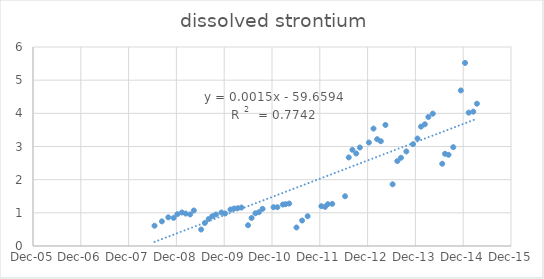
| Category | Series 0 |
|---|---|
| 39618.0 | 0.611 |
| 39674.0 | 0.743 |
| 39723.0 | 0.864 |
| 39764.0 | 0.848 |
| 39792.0 | 0.959 |
| 39827.0 | 1.01 |
| 39856.0 | 0.978 |
| 39890.0 | 0.952 |
| 39918.0 | 1.07 |
| 39974.0 | 0.497 |
| 40002.0 | 0.694 |
| 40031.0 | 0.812 |
| 40059.0 | 0.897 |
| 40087.0 | 0.949 |
| 40129.0 | 1.01 |
| 40157.0 | 0.98 |
| 40198.0 | 1.1 |
| 40226.0 | 1.13 |
| 40282.0 | 1.16 |
| 40254.0 | 1.14 |
| 40332.0 | 0.626 |
| 40359.0 | 0.845 |
| 40388.0 | 0.986 |
| 40415.0 | 1.02 |
| 40443.0 | 1.12 |
| 40527.0 | 1.17 |
| 40556.0 | 1.17 |
| 40598.0 | 1.25 |
| 40618.0 | 1.26 |
| 40646.0 | 1.28 |
| 40702.0 | 0.558 |
| 40745.0 | 0.768 |
| 40787.0 | 0.897 |
| 40892.0 | 1.2 |
| 40920.0 | 1.18 |
| 40941.0 | 1.26 |
| 40975.0 | 1.27 |
| 41073.0 | 1.5 |
| 41101.0 | 2.67 |
| 41129.0 | 2.9 |
| 41158.0 | 2.79 |
| 41186.0 | 2.97 |
| 41255.0 | 3.12 |
| 41290.0 | 3.54 |
| 41318.0 | 3.22 |
| 41346.0 | 3.16 |
| 41381.0 | 3.65 |
| 41436.0 | 1.86 |
| 41472.0 | 2.56 |
| 41500.0 | 2.66 |
| 41541.0 | 2.85 |
| 41592.0 | 3.07 |
| 41626.0 | 3.24 |
| 41653.0 | 3.6 |
| 41682.0 | 3.67 |
| 41709.0 | 3.89 |
| 41743.0 | 3.99 |
| 41815.0 | 2.48 |
| 41836.0 | 2.78 |
| 41863.0 | 2.75 |
| 41899.0 | 2.98 |
| 41957.0 | 4.69 |
| 41989.0 | 5.52 |
| 42017.0 | 4.02 |
| 42052.0 | 4.05 |
| 42080.0 | 4.29 |